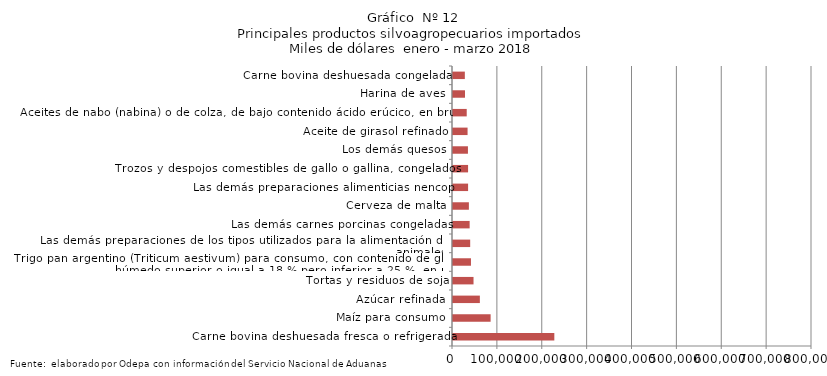
| Category | Series 0 |
|---|---|
| Carne bovina deshuesada fresca o refrigerada | 225799.669 |
| Maíz para consumo | 83832.034 |
| Azúcar refinada | 59853.885 |
| Tortas y residuos de soja | 45736.683 |
| Trigo pan argentino (Triticum aestivum) para consumo, con contenido de gluten húmedo superior o igual a 18 % pero inferior a 25 %, en peso | 40047.991 |
| Las demás preparaciones de los tipos utilizados para la alimentación de los animales | 38309.623 |
| Las demás carnes porcinas congeladas | 37102.392 |
| Cerveza de malta | 35384.884 |
| Las demás preparaciones alimenticias nencop | 33633.465 |
| Trozos y despojos comestibles de gallo o gallina, congelados | 33594.825 |
| Los demás quesos | 33294.872 |
| Aceite de girasol refinado | 32470.192 |
| Aceites de nabo (nabina) o de colza, de bajo contenido ácido erúcico, en bruto | 30578.404 |
| Harina de aves | 26690.837 |
| Carne bovina deshuesada congelada | 26378.054 |